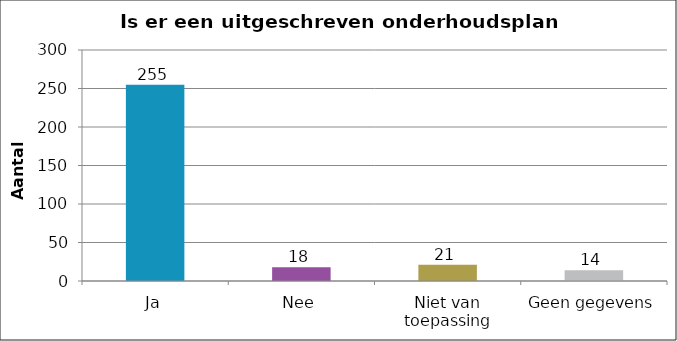
| Category | Series 0 |
|---|---|
| Ja | 255 |
| Nee | 18 |
| Niet van toepassing | 21 |
| Geen gegevens | 14 |